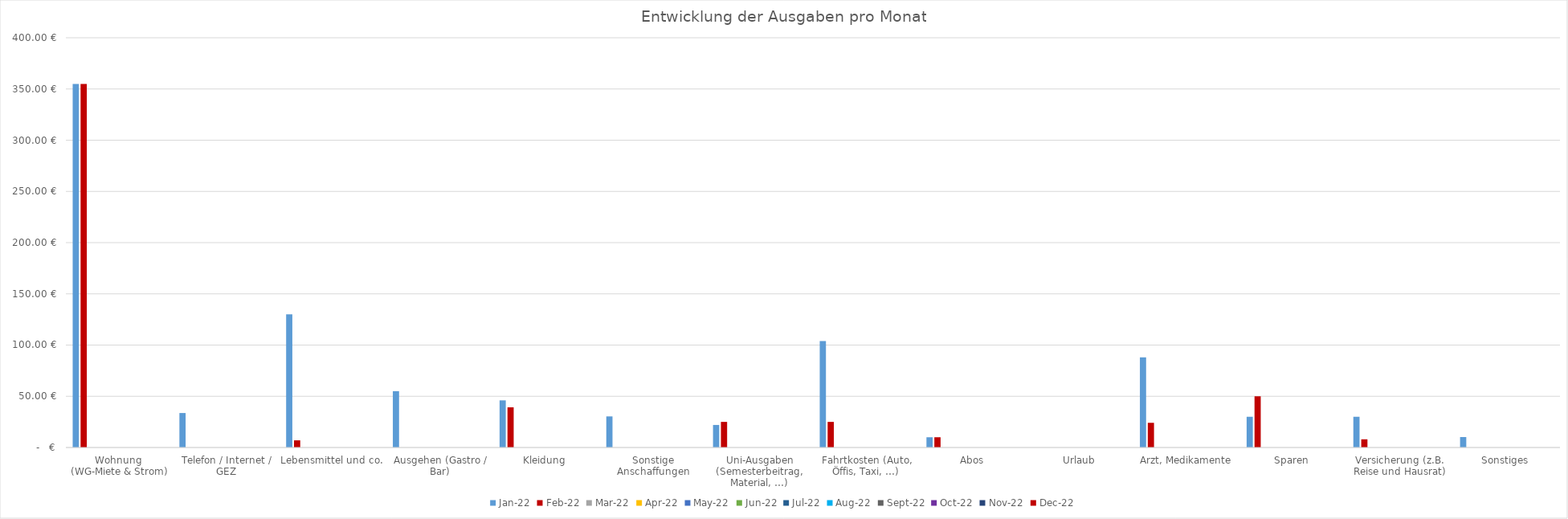
| Category | Jan 22 | Feb 22 | Mrz 22 | Apr 22 | Mai 22 | Jun 22 | Jul 22 | Aug 22 | Sep 22 | Okt 22 | Nov 22 | Dez 22 |
|---|---|---|---|---|---|---|---|---|---|---|---|---|
| Wohnung 
(WG-Miete & Strom) | 355 | 355 | 0 | 0 | 0 | 0 | 0 | 0 | 0 | 0 | 0 | 0 |
| Telefon / Internet / GEZ | 33.66 | 0 | 0 | 0 | 0 | 0 | 0 | 0 | 0 | 0 | 0 | 0 |
| Lebensmittel und co. | 130 | 6.99 | 0 | 0 | 0 | 0 | 0 | 0 | 0 | 0 | 0 | 0 |
| Ausgehen (Gastro / Bar) | 55 | 0 | 0 | 0 | 0 | 0 | 0 | 0 | 0 | 0 | 0 | 0 |
| Kleidung | 46.01 | 39.2 | 0 | 0 | 0 | 0 | 0 | 0 | 0 | 0 | 0 | 0 |
| Sonstige Anschaffungen | 30.35 | 0 | 0 | 0 | 0 | 0 | 0 | 0 | 0 | 0 | 0 | 0 |
| Uni-Ausgaben (Semesterbeitrag, Material, …) | 22.01 | 25 | 0 | 0 | 0 | 0 | 0 | 0 | 0 | 0 | 0 | 0 |
| Fahrtkosten (Auto, Öffis, Taxi, …) | 103.99 | 25 | 0 | 0 | 0 | 0 | 0 | 0 | 0 | 0 | 0 | 0 |
| Abos | 10 | 10 | 0 | 0 | 0 | 0 | 0 | 0 | 0 | 0 | 0 | 0 |
| Urlaub | 0 | 0 | 0 | 0 | 0 | 0 | 0 | 0 | 0 | 0 | 0 | 0 |
| Arzt, Medikamente | 88 | 24.1 | 0 | 0 | 0 | 0 | 0 | 0 | 0 | 0 | 0 | 0 |
| Sparen | 30 | 50 | 0 | 0 | 0 | 0 | 0 | 0 | 0 | 0 | 0 | 0 |
| Versicherung (z.B. Reise und Hausrat) | 30 | 7.99 | 0 | 0 | 0 | 0 | 0 | 0 | 0 | 0 | 0 | 0 |
| Sonstiges | 10.212 | 0 | 0 | 0 | 0 | 0 | 0 | 0 | 0 | 0 | 0 | 0 |